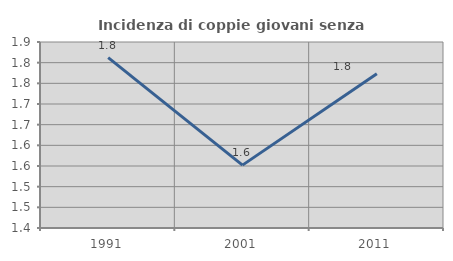
| Category | Incidenza di coppie giovani senza figli |
|---|---|
| 1991.0 | 1.812 |
| 2001.0 | 1.552 |
| 2011.0 | 1.773 |